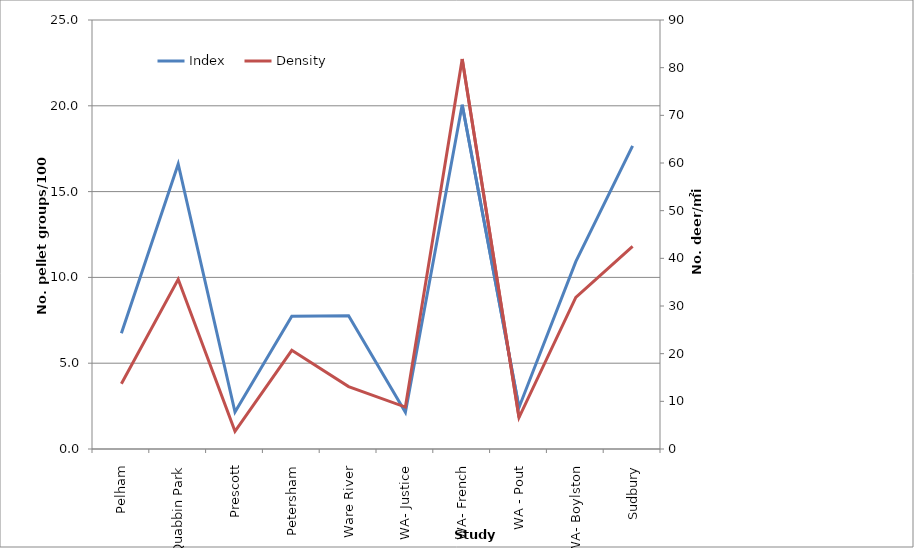
| Category | Index |
|---|---|
| Pelham | 6.751 |
| Quabbin Park | 16.608 |
| Prescott | 2.155 |
| Petersham | 7.733 |
| Ware River | 7.771 |
| WA- Justice | 2.147 |
| WA- French | 20.066 |
| WA - Pout | 2.423 |
| WA- Boylston | 10.914 |
| Sudbury | 17.668 |